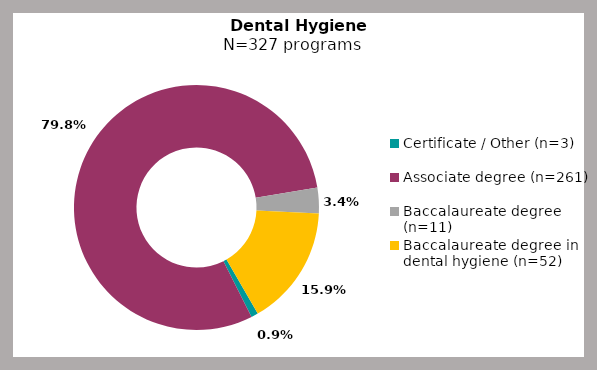
| Category | Series 0 |
|---|---|
| Certificate / Other (n=3) | 0.009 |
| Associate degree (n=261) | 0.798 |
| Baccalaureate degree (n=11) | 0.034 |
| Baccalaureate degree in dental hygiene (n=52) | 0.159 |